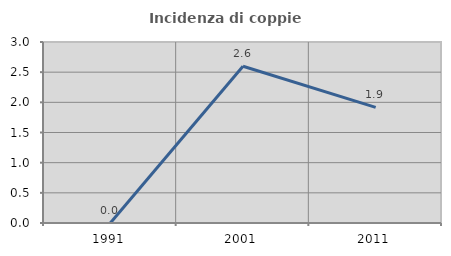
| Category | Incidenza di coppie miste |
|---|---|
| 1991.0 | 0 |
| 2001.0 | 2.597 |
| 2011.0 | 1.917 |